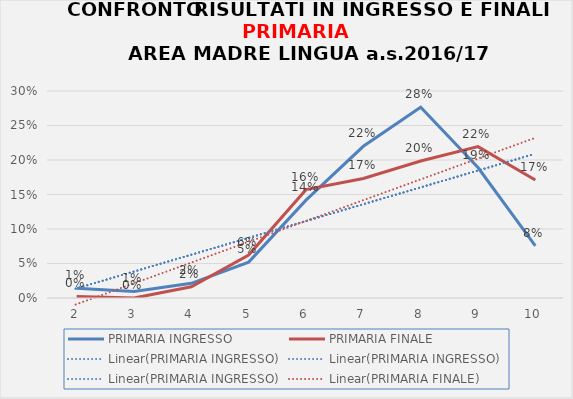
| Category | PRIMARIA INGRESSO | PRIMARIA FINALE |
|---|---|---|
| 2.0 | 0.014 | 0.002 |
| 3.0 | 0.009 | 0 |
| 4.0 | 0.021 | 0.016 |
| 5.0 | 0.052 | 0.062 |
| 6.0 | 0.142 | 0.157 |
| 7.0 | 0.22 | 0.173 |
| 8.0 | 0.277 | 0.199 |
| 9.0 | 0.189 | 0.219 |
| 10.0 | 0.076 | 0.171 |